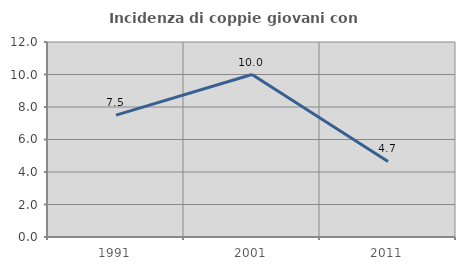
| Category | Incidenza di coppie giovani con figli |
|---|---|
| 1991.0 | 7.5 |
| 2001.0 | 10 |
| 2011.0 | 4.651 |